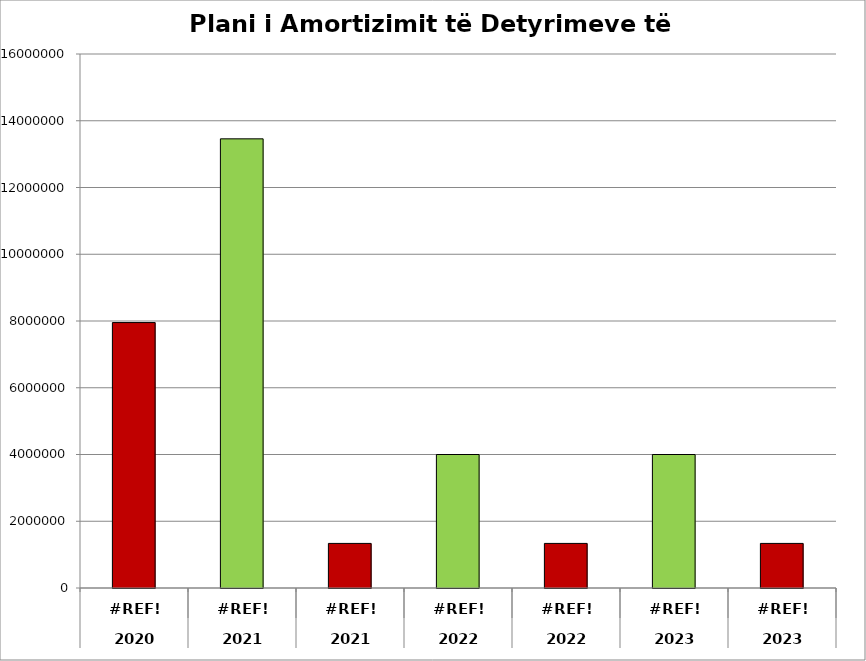
| Category | Series 0 |
|---|---|
| 0 | 7953101 |
| 1 | 13458022 |
| 2 | 1335976 |
| 3 | 4000000 |
| 4 | 1335976 |
| 5 | 4000000 |
| 6 | 1335976 |